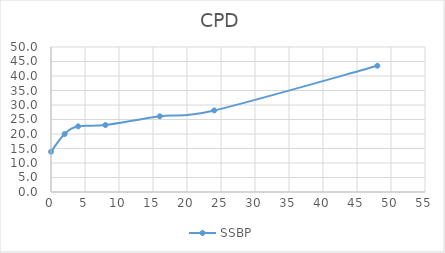
| Category | SSBP |
|---|---|
| 0.0 | 13.869 |
| 2.0 | 19.977 |
| 4.0 | 22.643 |
| 8.0 | 23.086 |
| 16.0 | 26.122 |
| 24.0 | 28.129 |
| 48.0 | 43.532 |